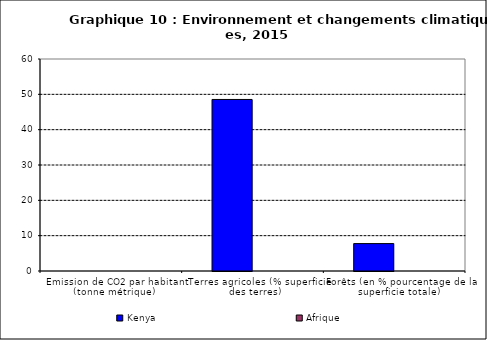
| Category | Kenya | Afrique |
|---|---|---|
| Emission de CO2 par habitant (tonne métrique) | 0 | 0 |
| Terres agricoles (% superficie des terres) | 48.547 | 0 |
| Forêts (en % pourcentage de la superficie totale) | 7.754 | 0 |